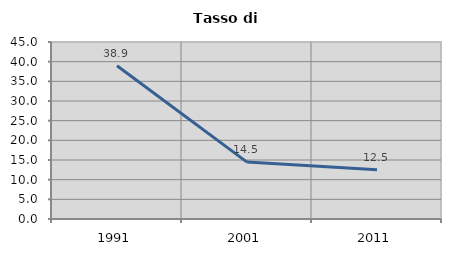
| Category | Tasso di disoccupazione   |
|---|---|
| 1991.0 | 38.942 |
| 2001.0 | 14.469 |
| 2011.0 | 12.5 |